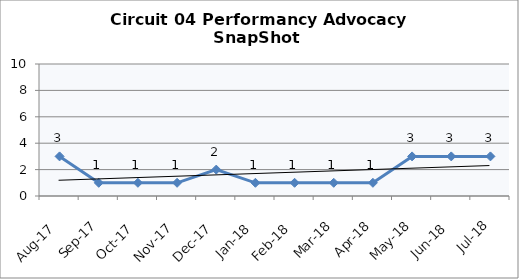
| Category | Circuit 04 |
|---|---|
| Aug-17 | 3 |
| Sep-17 | 1 |
| Oct-17 | 1 |
| Nov-17 | 1 |
| Dec-17 | 2 |
| Jan-18 | 1 |
| Feb-18 | 1 |
| Mar-18 | 1 |
| Apr-18 | 1 |
| May-18 | 3 |
| Jun-18 | 3 |
| Jul-18 | 3 |